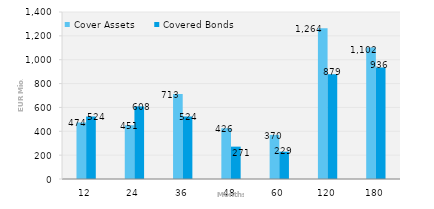
| Category | Cover Assets | Covered Bonds |
|---|---|---|
| 12.0 | 473.693 | 523.831 |
| 24.0 | 450.757 | 608.312 |
| 36.0 | 712.855 | 524 |
| 48.0 | 425.516 | 271.294 |
| 60.0 | 369.747 | 229.147 |
| 120.0 | 1263.853 | 879.118 |
| 180.0 | 1102.025 | 935.656 |